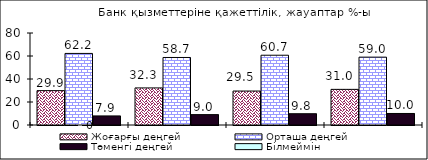
| Category | Жоғарғы деңгей | Орташа деңгей | Төменгі деңгей |
|---|---|---|---|
| 0 | 29.88 | 62.24 | 7.89 |
| 1 | 32.25 | 58.72 | 9.03 |
| 2 | 29.53 | 60.67 | 9.8 |
| 3 | 30.98 | 59 | 10.02 |